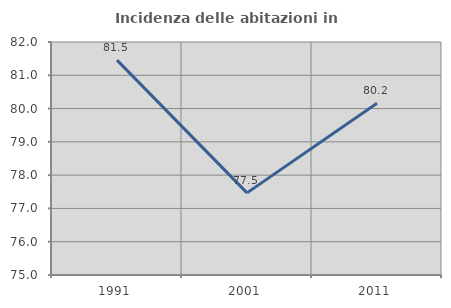
| Category | Incidenza delle abitazioni in proprietà  |
|---|---|
| 1991.0 | 81.455 |
| 2001.0 | 77.467 |
| 2011.0 | 80.162 |